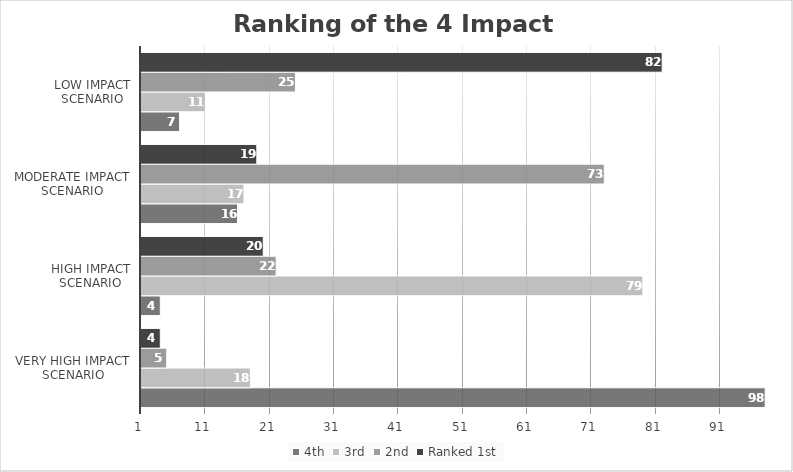
| Category | 4th | 3rd | 2nd | Ranked 1st |
|---|---|---|---|---|
| Very High Impact Scenario | 98 | 18 | 5 | 4 |
| High Impact Scenario | 4 | 79 | 22 | 20 |
| Moderate Impact Scenario | 16 | 17 | 73 | 19 |
| Low Impact Scenario | 7 | 11 | 25 | 82 |